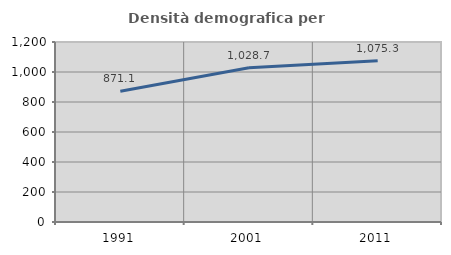
| Category | Densità demografica |
|---|---|
| 1991.0 | 871.128 |
| 2001.0 | 1028.694 |
| 2011.0 | 1075.33 |